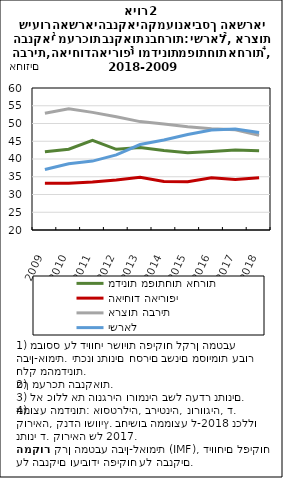
| Category | מדינות מפותחות אחרות | האיחוד האירופי | ארצות הברית | ישראל |
|---|---|---|---|---|
| 2009.0 | 42.065 | 33.187 | 52.89 | 37.021 |
| 2010.0 | 42.761 | 33.184 | 54.174 | 38.678 |
| 2011.0 | 45.282 | 33.51 | 53.135 | 39.404 |
| 2012.0 | 42.726 | 34.059 | 51.877 | 41.161 |
| 2013.0 | 43.233 | 34.879 | 50.533 | 44.077 |
| 2014.0 | 42.381 | 33.656 | 49.836 | 45.339 |
| 2015.0 | 41.777 | 33.605 | 49.115 | 46.9 |
| 2016.0 | 42.108 | 34.696 | 48.549 | 48.145 |
| 2017.0 | 42.508 | 34.237 | 48.241 | 48.425 |
| 2018.0 | 42.356 | 34.715 | 46.692 | 47.478 |